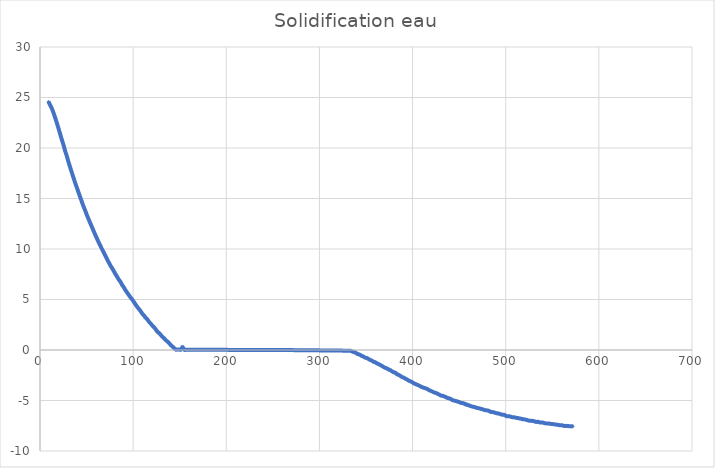
| Category | Series 0 |
|---|---|
| 9.001 | 24.608 |
| 10.811 | 24.266 |
| 12.605 | 23.936 |
| 14.414 | 23.504 |
| 16.209 | 23.015 |
| 18.003 | 22.503 |
| 19.812 | 21.957 |
| 21.606 | 21.399 |
| 23.4 | 20.831 |
| 25.21 | 20.307 |
| 27.004 | 19.704 |
| 28.813 | 19.192 |
| 30.607 | 18.612 |
| 32.401 | 18.077 |
| 34.211 | 17.554 |
| 36.005 | 17.042 |
| 37.815 | 16.53 |
| 39.609 | 16.064 |
| 41.403 | 15.586 |
| 43.212 | 15.12 |
| 45.006 | 14.653 |
| 46.8 | 14.198 |
| 48.61 | 13.788 |
| 50.404 | 13.345 |
| 52.214 | 12.947 |
| 54.008 | 12.548 |
| 55.802 | 12.162 |
| 57.611 | 11.775 |
| 59.405 | 11.388 |
| 61.215 | 11.024 |
| 63.009 | 10.66 |
| 64.803 | 10.319 |
| 66.612 | 9.977 |
| 68.406 | 9.659 |
| 70.2 | 9.34 |
| 72.01 | 8.987 |
| 73.804 | 8.68 |
| 75.614 | 8.362 |
| 77.408 | 8.1 |
| 79.202 | 7.816 |
| 81.011 | 7.52 |
| 82.805 | 7.247 |
| 84.615 | 6.974 |
| 86.409 | 6.746 |
| 88.203 | 6.439 |
| 90.013 | 6.2 |
| 91.807 | 5.916 |
| 93.601 | 5.677 |
| 95.41 | 5.438 |
| 97.204 | 5.21 |
| 99.014 | 4.994 |
| 100.808 | 4.755 |
| 102.602 | 4.505 |
| 104.411 | 4.266 |
| 106.205 | 4.061 |
| 108.015 | 3.845 |
| 109.809 | 3.595 |
| 111.603 | 3.424 |
| 113.413 | 3.197 |
| 115.207 | 3.038 |
| 117.001 | 2.799 |
| 118.81 | 2.617 |
| 120.604 | 2.423 |
| 122.414 | 2.253 |
| 124.208 | 2.048 |
| 126.002 | 1.82 |
| 127.812 | 1.684 |
| 129.606 | 1.502 |
| 131.4 | 1.308 |
| 133.209 | 1.16 |
| 135.003 | 0.978 |
| 136.813 | 0.842 |
| 138.607 | 0.683 |
| 140.401 | 0.489 |
| 142.211 | 0.341 |
| 144.005 | 0.193 |
| 145.814 | 0.034 |
| 147.608 | 0.048 |
| 149.402 | 0.034 |
| 151.212 | 0.032 |
| 153.006 | 0.3 |
| 154.8 | 0.025 |
| 156.609 | 0.024 |
| 158.403 | 0.02 |
| 160.213 | 0.03 |
| 162.007 | 0.03 |
| 163.801 | 0.032 |
| 165.611 | 0.024 |
| 167.405 | 0.025 |
| 169.214 | 0.03 |
| 171.008 | 0.024 |
| 172.802 | 0.02 |
| 174.612 | 0.02 |
| 176.406 | 0.018 |
| 178.2 | 0.018 |
| 180.01 | 0.018 |
| 181.804 | 0.02 |
| 183.613 | 0.02 |
| 185.407 | 0.018 |
| 187.201 | 0.018 |
| 189.011 | 0.015 |
| 190.805 | 0.015 |
| 192.614 | 0.018 |
| 194.408 | 0.014 |
| 196.202 | 0.014 |
| 198.012 | 0.012 |
| 199.806 | 0.013 |
| 201.6 | 0.012 |
| 203.41 | 0.012 |
| 205.204 | 0.01 |
| 207.013 | 0.011 |
| 208.807 | 0.01 |
| 210.601 | 0.008 |
| 212.411 | 0.008 |
| 214.205 | 0.007 |
| 216.015 | 0.007 |
| 217.809 | 0.008 |
| 219.603 | 0.006 |
| 221.412 | 0.005 |
| 223.206 | 0.005 |
| 225.0 | 0.004 |
| 226.81 | 0.005 |
| 228.604 | 0.002 |
| 230.413 | 0.002 |
| 232.207 | -0.001 |
| 234.002 | 0.001 |
| 235.811 | 0.002 |
| 237.605 | 0.001 |
| 239.415 | -0.002 |
| 241.209 | -0.002 |
| 243.003 | -0.005 |
| 244.812 | -0.004 |
| 246.606 | -0.003 |
| 248.4 | -0.005 |
| 250.21 | -0.008 |
| 252.004 | -0.007 |
| 253.814 | -0.008 |
| 255.608 | -0.008 |
| 257.402 | -0.007 |
| 259.211 | -0.01 |
| 261.005 | -0.008 |
| 262.815 | -0.007 |
| 264.609 | -0.005 |
| 266.403 | -0.009 |
| 268.213 | -0.01 |
| 270.007 | -0.012 |
| 271.801 | -0.012 |
| 273.61 | -0.015 |
| 275.404 | -0.016 |
| 277.214 | -0.018 |
| 279.008 | -0.015 |
| 280.802 | -0.015 |
| 282.611 | -0.016 |
| 284.405 | -0.02 |
| 286.215 | -0.02 |
| 288.009 | -0.022 |
| 289.803 | -0.024 |
| 291.613 | -0.026 |
| 293.407 | -0.03 |
| 295.201 | -0.031 |
| 297.01 | -0.034 |
| 298.804 | -0.036 |
| 300.614 | -0.039 |
| 302.408 | -0.042 |
| 304.202 | -0.042 |
| 306.012 | -0.045 |
| 307.806 | -0.044 |
| 309.6 | -0.048 |
| 311.409 | -0.052 |
| 313.203 | -0.055 |
| 315.013 | -0.054 |
| 316.807 | -0.059 |
| 318.601 | -0.058 |
| 320.41 | -0.059 |
| 322.204 | -0.061 |
| 324.014 | -0.061 |
| 325.808 | -0.064 |
| 327.602 | -0.065 |
| 329.412 | -0.068 |
| 331.206 | -0.067 |
| 333.0 | -0.068 |
| 334.809 | -0.137 |
| 336.603 | -0.205 |
| 338.413 | -0.239 |
| 340.207 | -0.364 |
| 342.001 | -0.421 |
| 343.811 | -0.489 |
| 345.605 | -0.592 |
| 347.414 | -0.66 |
| 349.208 | -0.762 |
| 351.002 | -0.796 |
| 352.812 | -0.899 |
| 354.606 | -0.99 |
| 356.4 | -1.058 |
| 358.209 | -1.172 |
| 360.004 | -1.217 |
| 361.813 | -1.331 |
| 363.607 | -1.399 |
| 365.401 | -1.49 |
| 367.211 | -1.581 |
| 369.005 | -1.684 |
| 370.814 | -1.775 |
| 372.608 | -1.832 |
| 374.402 | -1.934 |
| 376.212 | -2.002 |
| 378.006 | -2.116 |
| 379.8 | -2.207 |
| 381.61 | -2.253 |
| 383.404 | -2.412 |
| 385.213 | -2.469 |
| 387.007 | -2.571 |
| 388.801 | -2.685 |
| 390.611 | -2.742 |
| 392.405 | -2.844 |
| 394.215 | -2.924 |
| 396.009 | -3.038 |
| 397.803 | -3.106 |
| 399.612 | -3.185 |
| 401.406 | -3.299 |
| 403.2 | -3.367 |
| 405.01 | -3.447 |
| 406.804 | -3.515 |
| 408.613 | -3.606 |
| 410.407 | -3.686 |
| 412.201 | -3.743 |
| 414.011 | -3.8 |
| 415.805 | -3.86 |
| 417.615 | -3.97 |
| 419.409 | -4.039 |
| 421.203 | -4.118 |
| 423.012 | -4.198 |
| 424.806 | -4.243 |
| 426.6 | -4.323 |
| 428.41 | -4.403 |
| 430.204 | -4.505 |
| 432.014 | -4.528 |
| 433.808 | -4.585 |
| 435.602 | -4.664 |
| 437.411 | -4.744 |
| 439.205 | -4.79 |
| 441.015 | -4.846 |
| 442.809 | -4.96 |
| 444.603 | -5.006 |
| 446.412 | -5.051 |
| 448.206 | -5.097 |
| 450.0 | -5.154 |
| 451.81 | -5.233 |
| 453.604 | -5.256 |
| 455.414 | -5.301 |
| 457.208 | -5.404 |
| 459.002 | -5.438 |
| 460.811 | -5.484 |
| 462.605 | -5.563 |
| 455.414 | -5.301 |
| 457.208 | -5.404 |
| 459.002 | -5.438 |
| 460.811 | -5.484 |
| 462.605 | -5.563 |
| 464.415 | -5.609 |
| 466.209 | -5.643 |
| 468.003 | -5.7 |
| 469.813 | -5.745 |
| 471.607 | -5.779 |
| 473.401 | -5.825 |
| 475.21 | -5.87 |
| 477.004 | -5.939 |
| 478.814 | -5.973 |
| 480.608 | -5.984 |
| 482.402 | -6.052 |
| 484.212 | -6.143 |
| 486.006 | -6.143 |
| 487.8 | -6.189 |
| 489.609 | -6.246 |
| 491.403 | -6.28 |
| 493.213 | -6.314 |
| 495.007 | -6.371 |
| 496.801 | -6.416 |
| 498.61 | -6.428 |
| 500.404 | -6.53 |
| 502.214 | -6.564 |
| 504.008 | -6.564 |
| 505.802 | -6.621 |
| 507.612 | -6.667 |
| 509.406 | -6.667 |
| 511.2 | -6.712 |
| 513.009 | -6.735 |
| 514.803 | -6.78 |
| 516.613 | -6.803 |
| 518.407 | -6.86 |
| 520.201 | -6.871 |
| 522.011 | -6.917 |
| 523.805 | -6.962 |
| 525.614 | -7.008 |
| 527.408 | -7.008 |
| 529.202 | -7.031 |
| 531.012 | -7.065 |
| 532.806 | -7.133 |
| 534.6 | -7.099 |
| 536.409 | -7.167 |
| 538.203 | -7.179 |
| 540.013 | -7.19 |
| 541.807 | -7.247 |
| 543.601 | -7.27 |
| 545.411 | -7.281 |
| 547.205 | -7.292 |
| 549.014 | -7.327 |
| 550.808 | -7.338 |
| 552.602 | -7.361 |
| 554.412 | -7.395 |
| 556.206 | -7.406 |
| 558.0 | -7.452 |
| 559.81 | -7.44 |
| 561.604 | -7.486 |
| 563.413 | -7.531 |
| 565.207 | -7.509 |
| 567.001 | -7.531 |
| 568.811 | -7.543 |
| 570.605 | -7.554 |
| 572.414 | -7.554 |